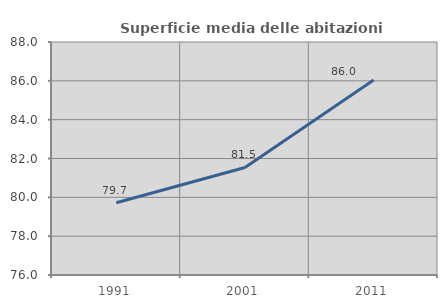
| Category | Superficie media delle abitazioni occupate |
|---|---|
| 1991.0 | 79.723 |
| 2001.0 | 81.54 |
| 2011.0 | 86.046 |